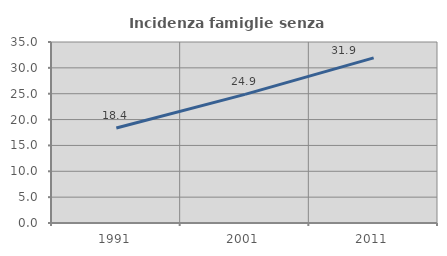
| Category | Incidenza famiglie senza nuclei |
|---|---|
| 1991.0 | 18.369 |
| 2001.0 | 24.88 |
| 2011.0 | 31.926 |